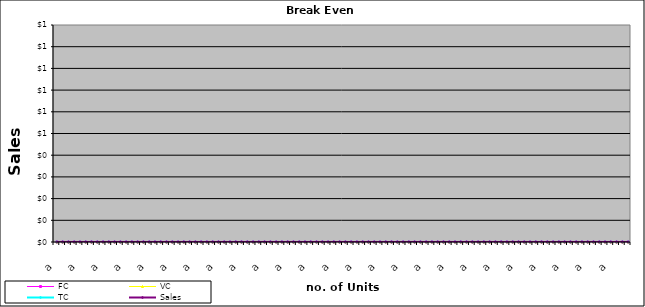
| Category | FC | VC | TC | Sales |
|---|---|---|---|---|
| 0.0 | 0 | 0 | 0 | 0 |
| 0.0 | 0 | 0 | 0 | 0 |
| 0.0 | 0 | 0 | 0 | 0 |
| 0.0 | 0 | 0 | 0 | 0 |
| 0.0 | 0 | 0 | 0 | 0 |
| 0.0 | 0 | 0 | 0 | 0 |
| 0.0 | 0 | 0 | 0 | 0 |
| 0.0 | 0 | 0 | 0 | 0 |
| 0.0 | 0 | 0 | 0 | 0 |
| 0.0 | 0 | 0 | 0 | 0 |
| 0.0 | 0 | 0 | 0 | 0 |
| 0.0 | 0 | 0 | 0 | 0 |
| 0.0 | 0 | 0 | 0 | 0 |
| 0.0 | 0 | 0 | 0 | 0 |
| 0.0 | 0 | 0 | 0 | 0 |
| 0.0 | 0 | 0 | 0 | 0 |
| 0.0 | 0 | 0 | 0 | 0 |
| 0.0 | 0 | 0 | 0 | 0 |
| 0.0 | 0 | 0 | 0 | 0 |
| 0.0 | 0 | 0 | 0 | 0 |
| 0.0 | 0 | 0 | 0 | 0 |
| 0.0 | 0 | 0 | 0 | 0 |
| 0.0 | 0 | 0 | 0 | 0 |
| 0.0 | 0 | 0 | 0 | 0 |
| 0.0 | 0 | 0 | 0 | 0 |
| 0.0 | 0 | 0 | 0 | 0 |
| 0.0 | 0 | 0 | 0 | 0 |
| 0.0 | 0 | 0 | 0 | 0 |
| 0.0 | 0 | 0 | 0 | 0 |
| 0.0 | 0 | 0 | 0 | 0 |
| 0.0 | 0 | 0 | 0 | 0 |
| 0.0 | 0 | 0 | 0 | 0 |
| 0.0 | 0 | 0 | 0 | 0 |
| 0.0 | 0 | 0 | 0 | 0 |
| 0.0 | 0 | 0 | 0 | 0 |
| 0.0 | 0 | 0 | 0 | 0 |
| 0.0 | 0 | 0 | 0 | 0 |
| 0.0 | 0 | 0 | 0 | 0 |
| 0.0 | 0 | 0 | 0 | 0 |
| 0.0 | 0 | 0 | 0 | 0 |
| 0.0 | 0 | 0 | 0 | 0 |
| 0.0 | 0 | 0 | 0 | 0 |
| 0.0 | 0 | 0 | 0 | 0 |
| 0.0 | 0 | 0 | 0 | 0 |
| 0.0 | 0 | 0 | 0 | 0 |
| 0.0 | 0 | 0 | 0 | 0 |
| 0.0 | 0 | 0 | 0 | 0 |
| 0.0 | 0 | 0 | 0 | 0 |
| 0.0 | 0 | 0 | 0 | 0 |
| 0.0 | 0 | 0 | 0 | 0 |
| 0.0 | 0 | 0 | 0 | 0 |
| 0.0 | 0 | 0 | 0 | 0 |
| 0.0 | 0 | 0 | 0 | 0 |
| 0.0 | 0 | 0 | 0 | 0 |
| 0.0 | 0 | 0 | 0 | 0 |
| 0.0 | 0 | 0 | 0 | 0 |
| 0.0 | 0 | 0 | 0 | 0 |
| 0.0 | 0 | 0 | 0 | 0 |
| 0.0 | 0 | 0 | 0 | 0 |
| 0.0 | 0 | 0 | 0 | 0 |
| 0.0 | 0 | 0 | 0 | 0 |
| 0.0 | 0 | 0 | 0 | 0 |
| 0.0 | 0 | 0 | 0 | 0 |
| 0.0 | 0 | 0 | 0 | 0 |
| 0.0 | 0 | 0 | 0 | 0 |
| 0.0 | 0 | 0 | 0 | 0 |
| 0.0 | 0 | 0 | 0 | 0 |
| 0.0 | 0 | 0 | 0 | 0 |
| 0.0 | 0 | 0 | 0 | 0 |
| 0.0 | 0 | 0 | 0 | 0 |
| 0.0 | 0 | 0 | 0 | 0 |
| 0.0 | 0 | 0 | 0 | 0 |
| 0.0 | 0 | 0 | 0 | 0 |
| 0.0 | 0 | 0 | 0 | 0 |
| 0.0 | 0 | 0 | 0 | 0 |
| 0.0 | 0 | 0 | 0 | 0 |
| 0.0 | 0 | 0 | 0 | 0 |
| 0.0 | 0 | 0 | 0 | 0 |
| 0.0 | 0 | 0 | 0 | 0 |
| 0.0 | 0 | 0 | 0 | 0 |
| 0.0 | 0 | 0 | 0 | 0 |
| 0.0 | 0 | 0 | 0 | 0 |
| 0.0 | 0 | 0 | 0 | 0 |
| 0.0 | 0 | 0 | 0 | 0 |
| 0.0 | 0 | 0 | 0 | 0 |
| 0.0 | 0 | 0 | 0 | 0 |
| 0.0 | 0 | 0 | 0 | 0 |
| 0.0 | 0 | 0 | 0 | 0 |
| 0.0 | 0 | 0 | 0 | 0 |
| 0.0 | 0 | 0 | 0 | 0 |
| 0.0 | 0 | 0 | 0 | 0 |
| 0.0 | 0 | 0 | 0 | 0 |
| 0.0 | 0 | 0 | 0 | 0 |
| 0.0 | 0 | 0 | 0 | 0 |
| 0.0 | 0 | 0 | 0 | 0 |
| 0.0 | 0 | 0 | 0 | 0 |
| 0.0 | 0 | 0 | 0 | 0 |
| 0.0 | 0 | 0 | 0 | 0 |
| 0.0 | 0 | 0 | 0 | 0 |
| 0.0 | 0 | 0 | 0 | 0 |